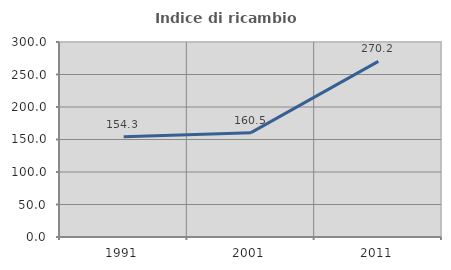
| Category | Indice di ricambio occupazionale  |
|---|---|
| 1991.0 | 154.331 |
| 2001.0 | 160.528 |
| 2011.0 | 270.152 |